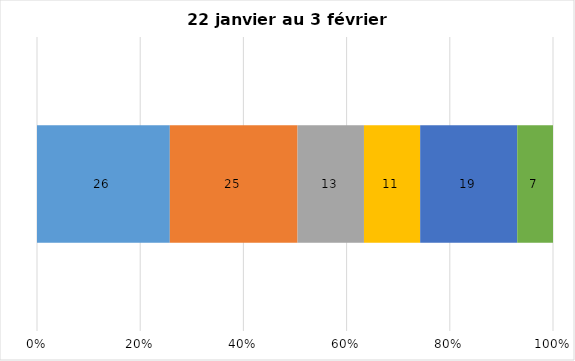
| Category | Plusieurs fois par jour | Une fois par jour | Quelques fois par semaine   | Une fois par semaine ou moins   |  Jamais   |  Je n’utilise pas les médias sociaux |
|---|---|---|---|---|---|---|
| 0 | 26 | 25 | 13 | 11 | 19 | 7 |